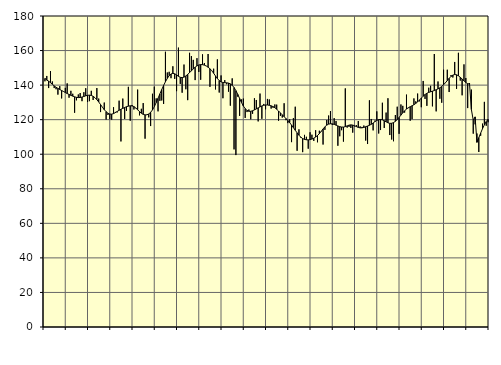
| Category | Piggar | Series 1 |
|---|---|---|
| nan | 142.2 | 143.91 |
| 1.0 | 145.3 | 142.91 |
| 1.0 | 138.3 | 142.27 |
| 1.0 | 148.1 | 141.39 |
| 1.0 | 142.1 | 140.5 |
| 1.0 | 138.3 | 139.56 |
| 1.0 | 137.6 | 138.77 |
| 1.0 | 134.5 | 138.1 |
| 1.0 | 139.4 | 137.48 |
| 1.0 | 132.3 | 136.88 |
| 1.0 | 136.2 | 136.31 |
| 1.0 | 138.4 | 135.72 |
| nan | 141 | 135.14 |
| 2.0 | 132.7 | 134.6 |
| 2.0 | 136.7 | 134.08 |
| 2.0 | 135 | 133.61 |
| 2.0 | 124 | 133.22 |
| 2.0 | 131.2 | 132.92 |
| 2.0 | 134.6 | 132.78 |
| 2.0 | 135.4 | 132.84 |
| 2.0 | 130.7 | 133.08 |
| 2.0 | 135.9 | 133.43 |
| 2.0 | 138.2 | 133.81 |
| 2.0 | 130.2 | 134.1 |
| nan | 130.7 | 134.19 |
| 3.0 | 136.7 | 134.01 |
| 3.0 | 131.4 | 133.52 |
| 3.0 | 132.7 | 132.69 |
| 3.0 | 138.3 | 131.58 |
| 3.0 | 132.2 | 130.25 |
| 3.0 | 124.4 | 128.76 |
| 3.0 | 127.3 | 127.21 |
| 3.0 | 129.9 | 125.78 |
| 3.0 | 120.1 | 124.61 |
| 3.0 | 122.7 | 123.73 |
| 3.0 | 120.3 | 123.25 |
| nan | 120 | 123.19 |
| 4.0 | 127.2 | 123.51 |
| 4.0 | 124.5 | 124.09 |
| 4.0 | 124.2 | 124.77 |
| 4.0 | 131 | 125.44 |
| 4.0 | 107.4 | 126.03 |
| 4.0 | 132.2 | 126.55 |
| 4.0 | 120.4 | 127.05 |
| 4.0 | 125.1 | 127.49 |
| 4.0 | 139 | 127.82 |
| 4.0 | 119.4 | 128.03 |
| 4.0 | 128.5 | 127.98 |
| nan | 125.9 | 127.57 |
| 5.0 | 126.6 | 126.78 |
| 5.0 | 137.4 | 125.74 |
| 5.0 | 122.5 | 124.66 |
| 5.0 | 126.3 | 123.71 |
| 5.0 | 129.6 | 123.08 |
| 5.0 | 109 | 122.77 |
| 5.0 | 122.7 | 122.82 |
| 5.0 | 121.3 | 123.3 |
| 5.0 | 116.3 | 124.24 |
| 5.0 | 135 | 125.64 |
| 5.0 | 139.1 | 127.54 |
| nan | 132.3 | 129.86 |
| 6.0 | 124.8 | 132.38 |
| 6.0 | 130.9 | 134.93 |
| 6.0 | 131.1 | 137.43 |
| 6.0 | 129.1 | 139.8 |
| 6.0 | 159.3 | 141.95 |
| 6.0 | 147.3 | 143.89 |
| 6.0 | 147.7 | 145.46 |
| 6.0 | 144 | 146.44 |
| 6.0 | 150.9 | 146.78 |
| 6.0 | 143.6 | 146.56 |
| 6.0 | 136.5 | 145.89 |
| nan | 161.7 | 145.09 |
| 7.0 | 140.7 | 144.52 |
| 7.0 | 135.6 | 144.35 |
| 7.0 | 151.9 | 144.62 |
| 7.0 | 137.6 | 145.3 |
| 7.0 | 131.3 | 146.21 |
| 7.0 | 158.7 | 147.21 |
| 7.0 | 156.8 | 148.29 |
| 7.0 | 154.6 | 149.36 |
| 7.0 | 142.9 | 150.35 |
| 7.0 | 155.6 | 151.13 |
| 7.0 | 147.6 | 151.67 |
| nan | 143.1 | 151.9 |
| 8.0 | 157.8 | 151.83 |
| 8.0 | 152.8 | 151.55 |
| 8.0 | 151.1 | 151.06 |
| 8.0 | 158 | 150.37 |
| 8.0 | 139 | 149.47 |
| 8.0 | 148.4 | 148.31 |
| 8.0 | 149.5 | 146.86 |
| 8.0 | 137.5 | 145.28 |
| 8.0 | 154.9 | 143.79 |
| 8.0 | 135.7 | 142.65 |
| 8.0 | 145.6 | 141.89 |
| nan | 132.4 | 141.51 |
| 9.0 | 142.9 | 141.39 |
| 9.0 | 140.5 | 141.33 |
| 9.0 | 136.2 | 141.16 |
| 9.0 | 128.1 | 140.72 |
| 9.0 | 143.9 | 139.9 |
| 9.0 | 102.8 | 138.61 |
| 9.0 | 99.5 | 136.81 |
| 9.0 | 133.3 | 134.65 |
| 9.0 | 122.2 | 132.29 |
| 9.0 | 131.7 | 129.96 |
| 9.0 | 132.2 | 127.93 |
| nan | 121 | 126.37 |
| 10.0 | 124.4 | 125.37 |
| 10.0 | 125.9 | 124.87 |
| 10.0 | 120.2 | 124.84 |
| 10.0 | 123.4 | 125.16 |
| 10.0 | 132.4 | 125.66 |
| 10.0 | 131.4 | 126.24 |
| 10.0 | 119 | 126.83 |
| 10.0 | 135.1 | 127.4 |
| 10.0 | 120.5 | 127.94 |
| 10.0 | 129.1 | 128.33 |
| 10.0 | 126 | 128.51 |
| nan | 132 | 128.49 |
| 11.0 | 131.7 | 128.31 |
| 11.0 | 126.4 | 128.02 |
| 11.0 | 126.9 | 127.58 |
| 11.0 | 128.8 | 126.91 |
| 11.0 | 128.7 | 126.04 |
| 11.0 | 119.4 | 125.01 |
| 11.0 | 122.2 | 123.9 |
| 11.0 | 121.2 | 122.81 |
| 11.0 | 129.5 | 121.73 |
| 11.0 | 119.7 | 120.64 |
| 11.0 | 118 | 119.51 |
| nan | 120.2 | 118.27 |
| 12.0 | 107 | 116.88 |
| 12.0 | 120.9 | 115.39 |
| 12.0 | 127.5 | 113.85 |
| 12.0 | 102 | 112.37 |
| 12.0 | 114.4 | 111.01 |
| 12.0 | 109.5 | 109.87 |
| 12.0 | 101.2 | 109.07 |
| 12.0 | 111.2 | 108.58 |
| 12.0 | 110.1 | 108.36 |
| 12.0 | 103.2 | 108.32 |
| 12.0 | 112.7 | 108.45 |
| nan | 111.3 | 108.77 |
| 13.0 | 107.7 | 109.28 |
| 13.0 | 113.9 | 109.95 |
| 13.0 | 106.9 | 110.81 |
| 13.0 | 113.6 | 111.9 |
| 13.0 | 113 | 113.22 |
| 13.0 | 105.6 | 114.63 |
| 13.0 | 114.1 | 115.88 |
| 13.0 | 119.8 | 116.84 |
| 13.0 | 122.4 | 117.42 |
| 13.0 | 125 | 117.64 |
| 13.0 | 116.9 | 117.57 |
| nan | 120.9 | 117.26 |
| 14.0 | 119.2 | 116.83 |
| 14.0 | 104.9 | 116.36 |
| 14.0 | 110.4 | 115.96 |
| 14.0 | 113.9 | 115.73 |
| 14.0 | 107.3 | 115.71 |
| 14.0 | 138.1 | 115.96 |
| 14.0 | 115.4 | 116.41 |
| 14.0 | 115.8 | 116.82 |
| 14.0 | 115.2 | 116.98 |
| 14.0 | 112.5 | 116.86 |
| 14.0 | 116.1 | 116.5 |
| nan | 116.8 | 115.99 |
| 15.0 | 119.2 | 115.51 |
| 15.0 | 116.1 | 115.26 |
| 15.0 | 115.8 | 115.27 |
| 15.0 | 116.6 | 115.51 |
| 15.0 | 107.9 | 115.91 |
| 15.0 | 105.9 | 116.33 |
| 15.0 | 131.2 | 116.74 |
| 15.0 | 120.4 | 117.31 |
| 15.0 | 113.8 | 118.07 |
| 15.0 | 119.5 | 118.89 |
| 15.0 | 124.8 | 119.58 |
| nan | 112 | 120.03 |
| 16.0 | 114 | 120.13 |
| 16.0 | 129.8 | 119.88 |
| 16.0 | 115.2 | 119.38 |
| 16.0 | 124.1 | 118.75 |
| 16.0 | 132.4 | 118.18 |
| 16.0 | 111.1 | 117.87 |
| 16.0 | 108.5 | 117.92 |
| 16.0 | 107.5 | 118.29 |
| 16.0 | 122.7 | 119.03 |
| 16.0 | 127.5 | 120.05 |
| 16.0 | 111.8 | 121.27 |
| nan | 128.8 | 122.62 |
| 17.0 | 128 | 123.96 |
| 17.0 | 124.1 | 125.16 |
| 17.0 | 134.5 | 126.14 |
| 17.0 | 126.7 | 126.91 |
| 17.0 | 119.4 | 127.49 |
| 17.0 | 120.3 | 128.03 |
| 17.0 | 132.3 | 128.63 |
| 17.0 | 130.6 | 129.4 |
| 17.0 | 135.1 | 130.32 |
| 17.0 | 130.6 | 131.34 |
| 17.0 | 127.2 | 132.48 |
| nan | 142.4 | 133.61 |
| 18.0 | 132 | 134.56 |
| 18.0 | 128 | 135.27 |
| 18.0 | 138.5 | 135.77 |
| 18.0 | 139.6 | 136.14 |
| 18.0 | 127.7 | 136.49 |
| 18.0 | 158 | 136.87 |
| 18.0 | 124.8 | 137.33 |
| 18.0 | 142.1 | 137.83 |
| 18.0 | 132.1 | 138.42 |
| 18.0 | 129.8 | 139.23 |
| 18.0 | 148.9 | 140.23 |
| nan | 141.2 | 141.37 |
| 19.0 | 148.9 | 142.62 |
| 19.0 | 136 | 143.92 |
| 19.0 | 145.8 | 145.02 |
| 19.0 | 144.4 | 145.78 |
| 19.0 | 153.4 | 146.12 |
| 19.0 | 137.8 | 145.97 |
| 19.0 | 158.7 | 145.38 |
| 19.0 | 142.6 | 144.55 |
| 19.0 | 134.1 | 143.54 |
| 19.0 | 152 | 142.47 |
| 19.0 | 144.1 | 141.51 |
| nan | 126.7 | 140.83 |
| 20.0 | 141.2 | 140.67 |
| 20.0 | 137.4 | 125.87 |
| 20.0 | 111.9 | 119.71 |
| 20.0 | 117.3 | 121.61 |
| 20.0 | 112 | 106.9 |
| 20.0 | 101.3 | 109.54 |
| 20.0 | 110.7 | 112.24 |
| 20.0 | 117.7 | 114.76 |
| 20.0 | 130.3 | 117.01 |
| 20.0 | 116.5 | 118.87 |
| 20.0 | 118.5 | 120.25 |